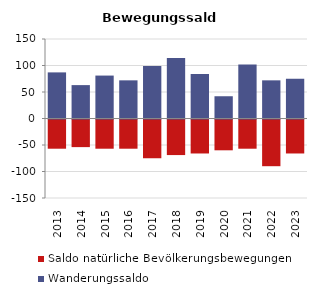
| Category | Saldo natürliche Bevölkerungsbewegungen | Wanderungssaldo |
|---|---|---|
| 2013.0 | -57 | 87 |
| 2014.0 | -54 | 63 |
| 2015.0 | -57 | 81 |
| 2016.0 | -57 | 72 |
| 2017.0 | -75 | 99 |
| 2018.0 | -69 | 114 |
| 2019.0 | -66 | 84 |
| 2020.0 | -60 | 42 |
| 2021.0 | -57 | 102 |
| 2022.0 | -90 | 72 |
| 2023.0 | -66 | 75 |